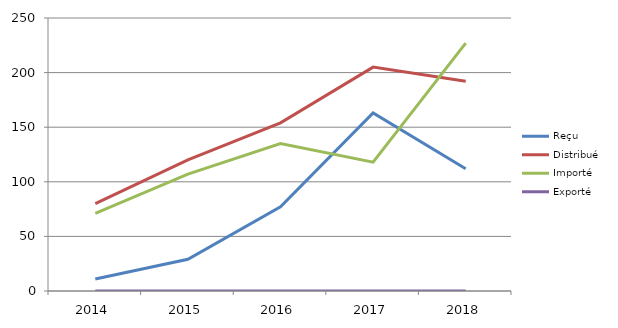
| Category | Reçu | Distribué | Importé | Exporté |
|---|---|---|---|---|
| 2014.0 | 11 | 80 | 71 | 0 |
| 2015.0 | 29 | 120 | 107 | 0 |
| 2016.0 | 77 | 154 | 135 | 0 |
| 2017.0 | 163 | 205 | 118 | 0 |
| 2018.0 | 112 | 192 | 227 | 0 |